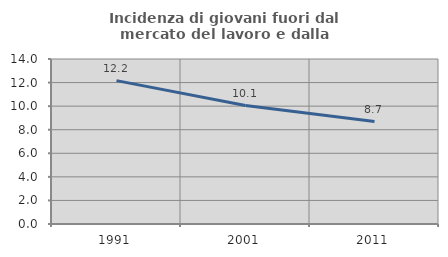
| Category | Incidenza di giovani fuori dal mercato del lavoro e dalla formazione  |
|---|---|
| 1991.0 | 12.167 |
| 2001.0 | 10.053 |
| 2011.0 | 8.696 |